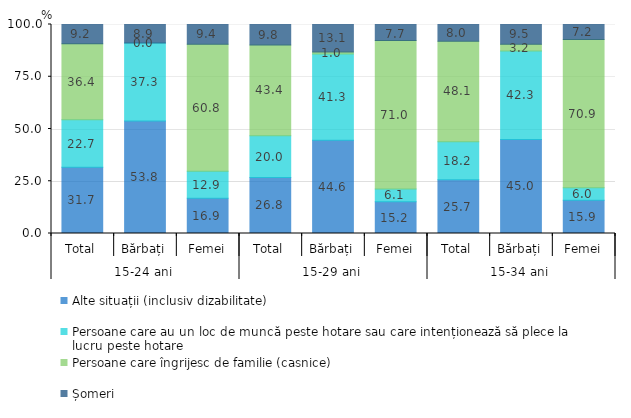
| Category | Alte situații (inclusiv dizabilitate) | Persoane care au un loc de muncă peste hotare sau care intenționează să plece la lucru peste hotare | Persoane care îngrijesc de familie (casnice) | Șomeri |
|---|---|---|---|---|
| 0 | 31.7 | 22.7 | 36.4 | 9.2 |
| 1 | 53.8 | 37.3 | 0 | 8.9 |
| 2 | 16.9 | 12.9 | 60.8 | 9.4 |
| 3 | 26.8 | 20 | 43.4 | 9.8 |
| 4 | 44.6 | 41.3 | 1 | 13.1 |
| 5 | 15.2 | 6.1 | 71 | 7.7 |
| 6 | 25.7 | 18.2 | 48.1 | 8 |
| 7 | 45 | 42.3 | 3.2 | 9.5 |
| 8 | 15.9 | 6 | 70.9 | 7.2 |